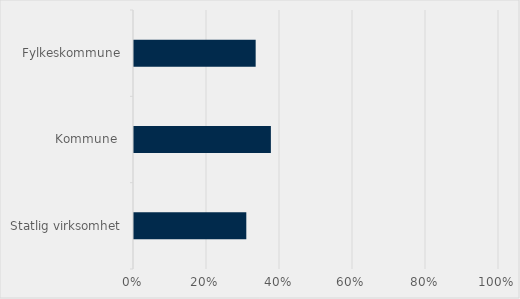
| Category | Prosent |
|---|---|
| Statlig virksomhet | 0.308 |
| Kommune  | 0.375 |
| Fylkeskommune | 0.333 |